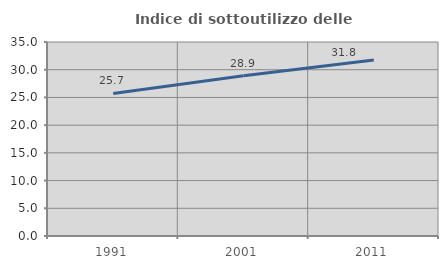
| Category | Indice di sottoutilizzo delle abitazioni  |
|---|---|
| 1991.0 | 25.727 |
| 2001.0 | 28.922 |
| 2011.0 | 31.759 |